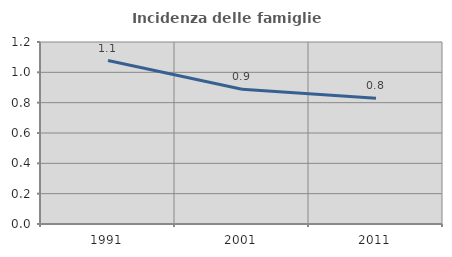
| Category | Incidenza delle famiglie numerose |
|---|---|
| 1991.0 | 1.078 |
| 2001.0 | 0.888 |
| 2011.0 | 0.83 |